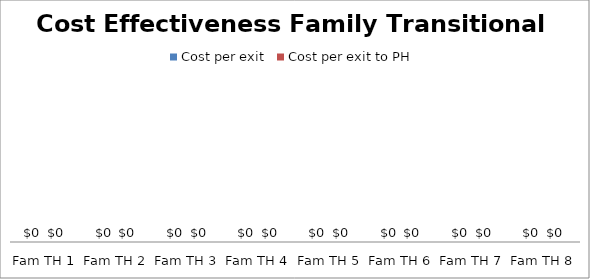
| Category | Cost per exit | Cost per exit to PH |
|---|---|---|
| Fam TH 1 | 0 | 0 |
| Fam TH 2 | 0 | 0 |
| Fam TH 3 | 0 | 0 |
| Fam TH 4 | 0 | 0 |
| Fam TH 5 | 0 | 0 |
| Fam TH 6 | 0 | 0 |
| Fam TH 7 | 0 | 0 |
| Fam TH 8 | 0 | 0 |